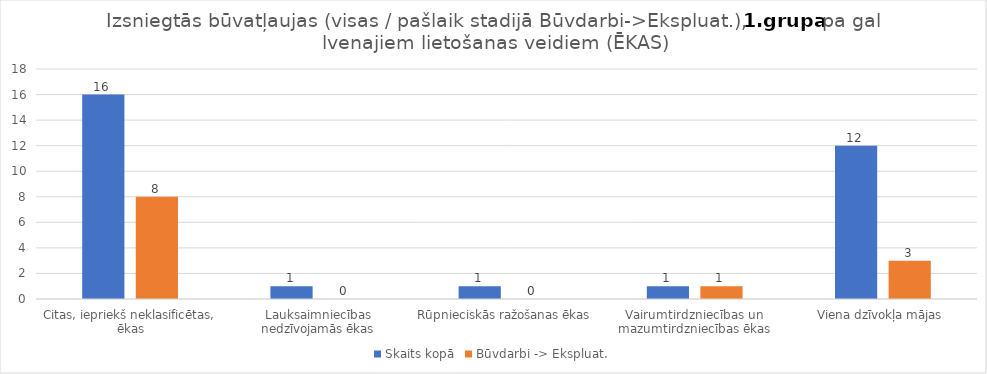
| Category | Skaits kopā | Būvdarbi -> Ekspluat. |
|---|---|---|
| Citas, iepriekš neklasificētas, ēkas | 16 | 8 |
| Lauksaimniecības nedzīvojamās ēkas | 1 | 0 |
| Rūpnieciskās ražošanas ēkas | 1 | 0 |
| Vairumtirdzniecības un mazumtirdzniecības ēkas | 1 | 1 |
| Viena dzīvokļa mājas | 12 | 3 |